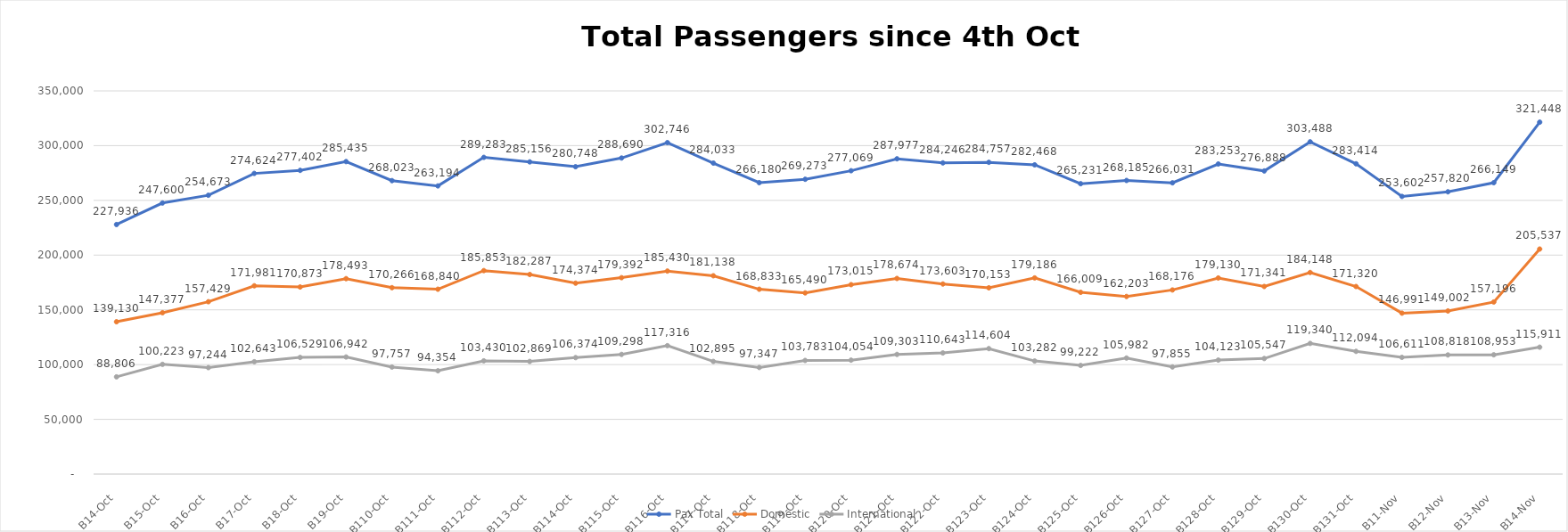
| Category | Pax Total |  Domestic  |  International  |
|---|---|---|---|
| 2022-10-04 | 227936 | 139130 | 88806 |
| 2022-10-05 | 247600 | 147377 | 100223 |
| 2022-10-06 | 254673 | 157429 | 97244 |
| 2022-10-07 | 274624 | 171981 | 102643 |
| 2022-10-08 | 277402 | 170873 | 106529 |
| 2022-10-09 | 285435 | 178493 | 106942 |
| 2022-10-10 | 268023 | 170266 | 97757 |
| 2022-10-11 | 263194 | 168840 | 94354 |
| 2022-10-12 | 289283 | 185853 | 103430 |
| 2022-10-13 | 285156 | 182287 | 102869 |
| 2022-10-14 | 280748 | 174374 | 106374 |
| 2022-10-15 | 288690 | 179392 | 109298 |
| 2022-10-16 | 302746 | 185430 | 117316 |
| 2022-10-17 | 284033 | 181138 | 102895 |
| 2022-10-18 | 266180 | 168833 | 97347 |
| 2022-10-19 | 269273 | 165490 | 103783 |
| 2022-10-20 | 277069 | 173015 | 104054 |
| 2022-10-21 | 287977 | 178674 | 109303 |
| 2022-10-22 | 284246 | 173603 | 110643 |
| 2022-10-23 | 284757 | 170153 | 114604 |
| 2022-10-24 | 282468 | 179186 | 103282 |
| 2022-10-25 | 265231 | 166009 | 99222 |
| 2022-10-26 | 268185 | 162203 | 105982 |
| 2022-10-27 | 266031 | 168176 | 97855 |
| 2022-10-28 | 283253 | 179130 | 104123 |
| 2022-10-29 | 276888 | 171341 | 105547 |
| 2022-10-30 | 303488 | 184148 | 119340 |
| 2022-10-31 | 283414 | 171320 | 112094 |
| 2022-11-01 | 253602 | 146991 | 106611 |
| 2022-11-02 | 257820 | 149002 | 108818 |
| 2022-11-03 | 266149 | 157196 | 108953 |
| 2022-11-04 | 321448 | 205537 | 115911 |